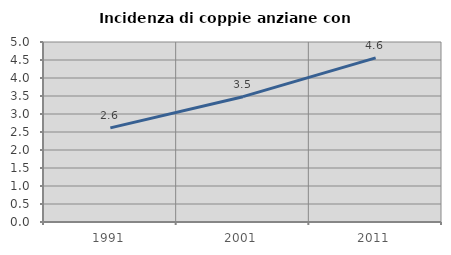
| Category | Incidenza di coppie anziane con figli |
|---|---|
| 1991.0 | 2.614 |
| 2001.0 | 3.481 |
| 2011.0 | 4.559 |